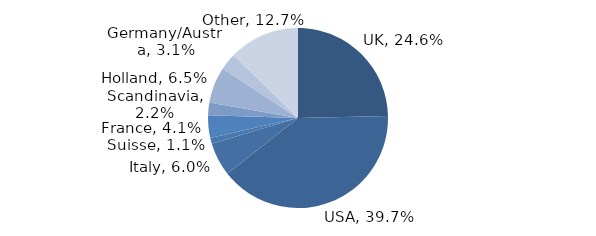
| Category | Investment Style |
|---|---|
| UK | 0.246 |
| USA | 0.397 |
| Italy | 0.06 |
| Suisse | 0.011 |
| France | 0.041 |
| Scandinavia | 0.022 |
| Holland | 0.065 |
| Germany/Austria | 0.031 |
| Other | 0.127 |